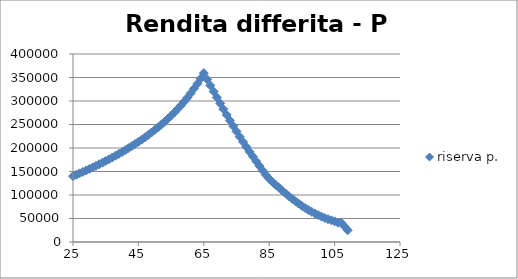
| Category | riserva p. |
|---|---|
| 25.0 | 140113.606 |
| 26.0 | 143047.947 |
| 27.0 | 146040.897 |
| 28.0 | 149096.589 |
| 29.0 | 152214.791 |
| 30.0 | 155393.582 |
| 31.0 | 158642.112 |
| 32.0 | 161958.682 |
| 33.0 | 165349.786 |
| 34.0 | 168818.944 |
| 35.0 | 172373.4 |
| 36.0 | 176006.49 |
| 37.0 | 179725.576 |
| 38.0 | 183531.015 |
| 39.0 | 187430.771 |
| 40.0 | 191429.448 |
| 41.0 | 195533.933 |
| 42.0 | 199743.327 |
| 43.0 | 204069.129 |
| 44.0 | 208515.093 |
| 45.0 | 213098.398 |
| 46.0 | 217821.795 |
| 47.0 | 222688.048 |
| 48.0 | 227728.493 |
| 49.0 | 232933.423 |
| 50.0 | 238319.33 |
| 51.0 | 243904.109 |
| 52.0 | 249715.144 |
| 53.0 | 255763.41 |
| 54.0 | 262122.245 |
| 55.0 | 268720.311 |
| 56.0 | 275613.551 |
| 57.0 | 282858.206 |
| 58.0 | 290542.61 |
| 59.0 | 298654.602 |
| 60.0 | 307325.884 |
| 61.0 | 316486.932 |
| 62.0 | 326202.821 |
| 63.0 | 336531.959 |
| 64.0 | 347499.964 |
| 65.0 | 359286.049 |
| 66.0 | 346155.559 |
| 67.0 | 333153.68 |
| 68.0 | 320289.824 |
| 69.0 | 307508.172 |
| 70.0 | 294914.029 |
| 71.0 | 282555.156 |
| 72.0 | 270368.959 |
| 73.0 | 258422.19 |
| 74.0 | 246640.782 |
| 75.0 | 235108.422 |
| 76.0 | 223867.077 |
| 77.0 | 212928.248 |
| 78.0 | 202243.645 |
| 79.0 | 191915.472 |
| 80.0 | 181897.768 |
| 81.0 | 172027.754 |
| 82.0 | 161977.178 |
| 83.0 | 151962.808 |
| 84.0 | 142530.261 |
| 85.0 | 134522.975 |
| 86.0 | 127614.019 |
| 87.0 | 121376.637 |
| 88.0 | 115506.208 |
| 89.0 | 109308.726 |
| 90.0 | 103266.19 |
| 91.0 | 97432.321 |
| 92.0 | 92026.084 |
| 93.0 | 86790.488 |
| 94.0 | 81695.121 |
| 95.0 | 76787.623 |
| 96.0 | 72171.568 |
| 97.0 | 68003.384 |
| 98.0 | 64136.475 |
| 99.0 | 60544.127 |
| 100.0 | 57244.752 |
| 101.0 | 54062.88 |
| 102.0 | 51097.132 |
| 103.0 | 48553.193 |
| 104.0 | 46200.493 |
| 105.0 | 43924.771 |
| 106.0 | 41180.303 |
| 107.0 | 41259.772 |
| 108.0 | 33169.935 |
| 109.0 | 25000 |